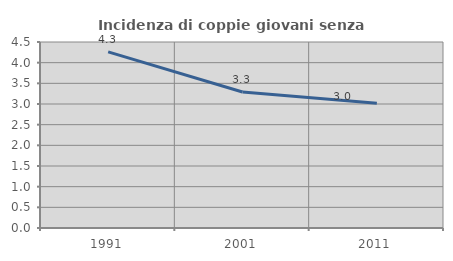
| Category | Incidenza di coppie giovani senza figli |
|---|---|
| 1991.0 | 4.26 |
| 2001.0 | 3.291 |
| 2011.0 | 3.02 |